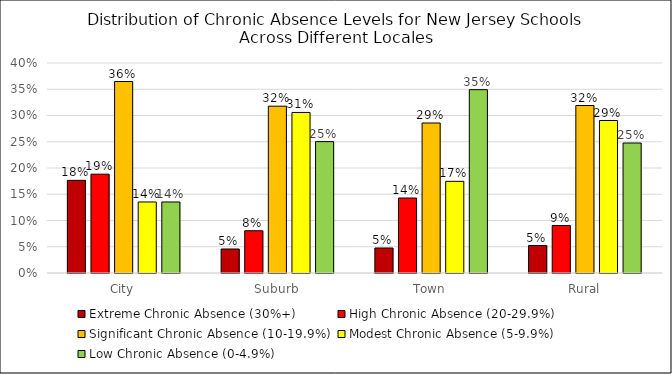
| Category | Extreme Chronic Absence (30%+) | High Chronic Absence (20-29.9%) | Significant Chronic Absence (10-19.9%) | Modest Chronic Absence (5-9.9%) | Low Chronic Absence (0-4.9%) |
|---|---|---|---|---|---|
| City | 0.176 | 0.188 | 0.365 | 0.135 | 0.135 |
| Suburb | 0.046 | 0.08 | 0.318 | 0.306 | 0.25 |
| Town | 0.048 | 0.143 | 0.286 | 0.175 | 0.349 |
| Rural | 0.052 | 0.09 | 0.319 | 0.29 | 0.248 |